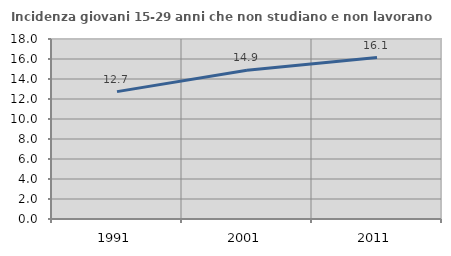
| Category | Incidenza giovani 15-29 anni che non studiano e non lavorano  |
|---|---|
| 1991.0 | 12.737 |
| 2001.0 | 14.876 |
| 2011.0 | 16.139 |